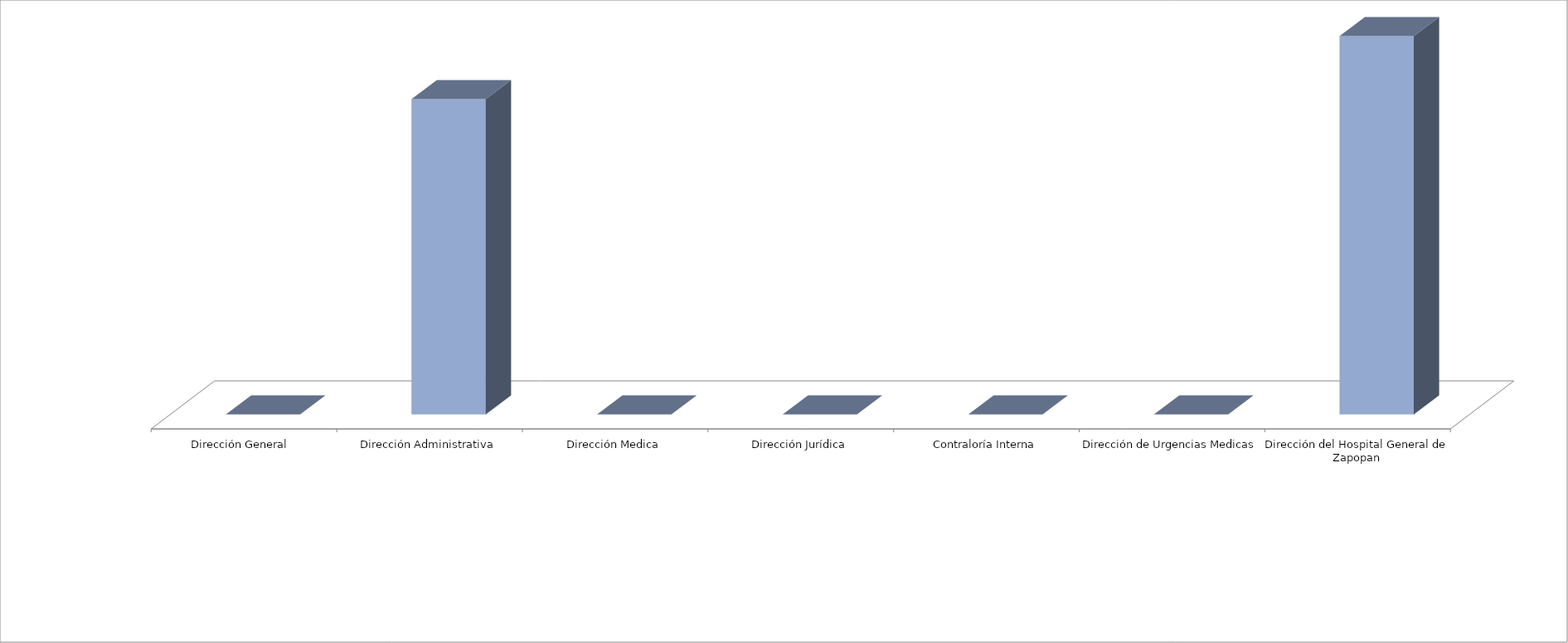
| Category | Series 0 | Series 1 |
|---|---|---|
| Dirección General  |  | 0 |
| Dirección Administrativa |  | 5 |
| Dirección Medica |  | 0 |
| Dirección Jurídica |  | 0 |
| Contraloría Interna |  | 0 |
| Dirección de Urgencias Medicas |  | 0 |
| Dirección del Hospital General de Zapopan |  | 6 |